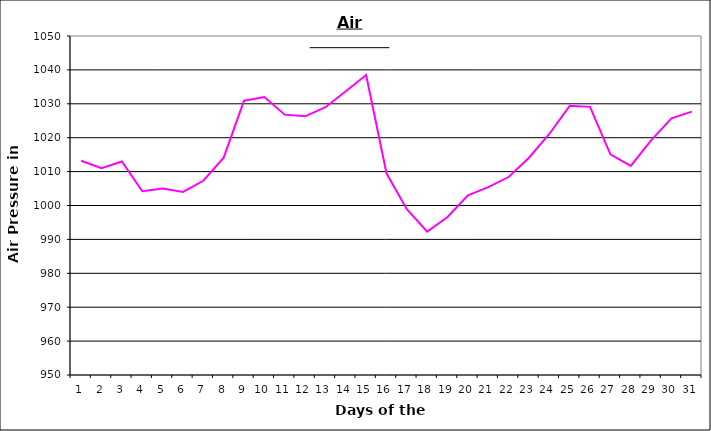
| Category | Series 0 |
|---|---|
| 0 | 1013.2 |
| 1 | 1011 |
| 2 | 1013 |
| 3 | 1004.2 |
| 4 | 1005 |
| 5 | 1004 |
| 6 | 1007.3 |
| 7 | 1014.1 |
| 8 | 1030.9 |
| 9 | 1032 |
| 10 | 1026.8 |
| 11 | 1026.3 |
| 12 | 1029 |
| 13 | 1033.7 |
| 14 | 1038.5 |
| 15 | 1009.5 |
| 16 | 998.9 |
| 17 | 992.3 |
| 18 | 996.6 |
| 19 | 1003 |
| 20 | 1005.4 |
| 21 | 1008.4 |
| 22 | 1014.1 |
| 23 | 1021.1 |
| 24 | 1029.4 |
| 25 | 1029.1 |
| 26 | 1015.1 |
| 27 | 1011.7 |
| 28 | 1019.2 |
| 29 | 1025.7 |
| 30 | 1027.7 |